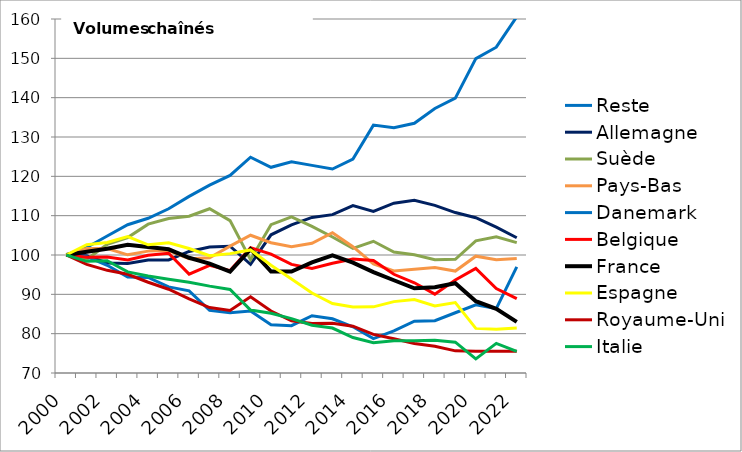
| Category | Reste | Allemagne  | Suède | Pays-Bas | Danemark | Belgique | France | Espagne | Royaume-Uni | Italie |
|---|---|---|---|---|---|---|---|---|---|---|
| 2000 | 100 | 100 | 100 | 100 | 100 | 100 | 100 | 100 | 100 | 100 |
| 2001 | 101.91 | 99.818 | 98.905 | 101.667 | 99.591 | 99.458 | 100.831 | 102.629 | 97.6 | 98.388 |
| 2002 | 104.845 | 97.964 | 102.687 | 101.624 | 97.393 | 99.495 | 101.597 | 103.169 | 96.1 | 98.553 |
| 2003 | 107.701 | 97.828 | 104.439 | 100.043 | 94.414 | 98.751 | 102.614 | 104.678 | 95.097 | 95.716 |
| 2004 | 109.344 | 98.715 | 107.841 | 100.985 | 94.283 | 99.957 | 102.048 | 102.591 | 93.067 | 94.675 |
| 2005 | 111.75 | 98.745 | 109.294 | 101.117 | 91.884 | 100.461 | 101.445 | 103.1 | 91.301 | 93.848 |
| 2006 | 114.894 | 100.901 | 109.871 | 99.049 | 90.879 | 95.13 | 99.303 | 101.651 | 88.862 | 93.07 |
| 2007 | 117.762 | 102.048 | 111.763 | 99.287 | 85.924 | 97.361 | 97.821 | 99.807 | 86.639 | 92.09 |
| 2008 | 120.227 | 102.248 | 108.733 | 102.268 | 85.348 | 96.032 | 95.754 | 100.351 | 85.911 | 91.24 |
| 2009 | 124.856 | 97.644 | 98.799 | 105.024 | 85.749 | 101.876 | 101.488 | 101.281 | 89.362 | 86.007 |
| 2010 | 122.297 | 105.142 | 107.705 | 103.108 | 82.242 | 100.231 | 95.81 | 97.397 | 85.753 | 85.199 |
| 2011 | 123.712 | 107.652 | 109.708 | 102.102 | 82.04 | 97.61 | 95.797 | 93.922 | 83.272 | 83.812 |
| 2012 | 122.791 | 109.543 | 107.297 | 102.963 | 84.572 | 96.596 | 98.108 | 90.346 | 82.592 | 82.157 |
| 2013 | 121.858 | 110.266 | 104.58 | 105.674 | 83.781 | 97.9 | 99.925 | 87.664 | 82.623 | 81.426 |
| 2014 | 124.373 | 112.571 | 101.699 | 102.113 | 81.74 | 98.959 | 98.072 | 86.787 | 81.911 | 79.022 |
| 2015 | 133.023 | 111.065 | 103.49 | 97.73 | 78.749 | 98.61 | 95.644 | 86.812 | 79.822 | 77.672 |
| 2016 | 132.35 | 113.174 | 100.738 | 95.934 | 80.718 | 95.102 | 93.579 | 88.145 | 78.708 | 78.175 |
| 2017 | 133.498 | 113.899 | 100.057 | 96.38 | 83.182 | 92.935 | 91.522 | 88.694 | 77.516 | 78.219 |
| 2018 | 137.254 | 112.618 | 98.806 | 96.791 | 83.283 | 90.041 | 91.795 | 87.061 | 76.819 | 78.346 |
| 2019 | 139.883 | 110.792 | 98.895 | 95.911 | 85.315 | 93.633 | 92.833 | 87.917 | 75.628 | 77.839 |
| 2020 | 149.938 | 109.47 | 103.598 | 99.702 | 87.353 | 96.603 | 88.266 | 81.339 | 75.536 | 73.58 |
| 2021 | 152.83 | 107.071 | 104.64 | 98.767 | 86.366 | 91.463 | 86.301 | 81.104 | 75.536 | 77.537 |
| 2022 | 160.576 | 104.377 | 103.148 | 99.096 | 96.963 | 88.902 | 82.999 | 81.446 | 75.536 | 75.513 |